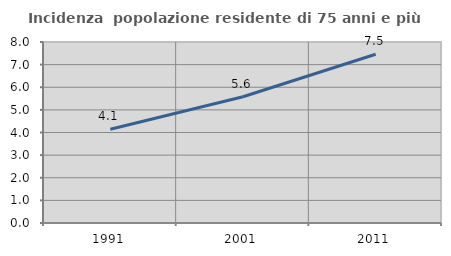
| Category | Incidenza  popolazione residente di 75 anni e più |
|---|---|
| 1991.0 | 4.147 |
| 2001.0 | 5.58 |
| 2011.0 | 7.457 |